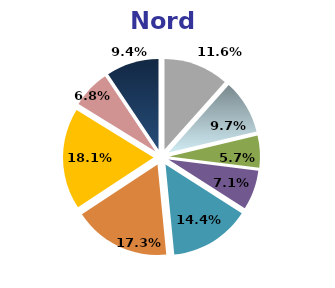
| Category | Nord |
|---|---|
| Agricoltura | 11.6 |
| Industria in senso stretto | 9.7 |
| Costruzioni | 5.7 |
| Commercio e riparazioni | 7.1 |
| Alberghi e ristoranti | 14.4 |
| Trasporti, comunicazioni etc. | 17.3 |
| P.A., istruzione e sanità | 18.1 |
| Attività svolte da famiglie e convivenze | 6.8 |
| Altri servizi pubblici, sociali e personali | 9.4 |